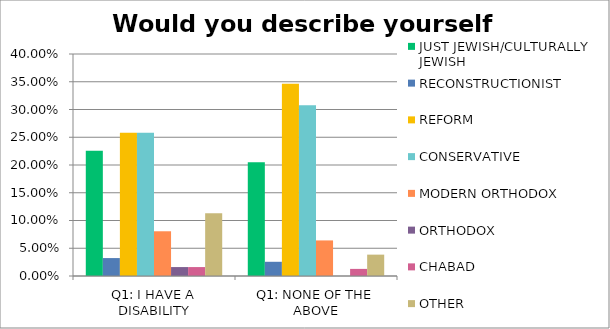
| Category | JUST JEWISH/CULTURALLY JEWISH | RECONSTRUCTIONIST | REFORM | CONSERVATIVE | MODERN ORTHODOX | ORTHODOX | CHABAD | OTHER |
|---|---|---|---|---|---|---|---|---|
| Q1: I HAVE A DISABILITY | 0.226 | 0.032 | 0.258 | 0.258 | 0.081 | 0.016 | 0.016 | 0.113 |
| Q1: NONE OF THE ABOVE | 0.205 | 0.026 | 0.346 | 0.308 | 0.064 | 0 | 0.013 | 0.038 |